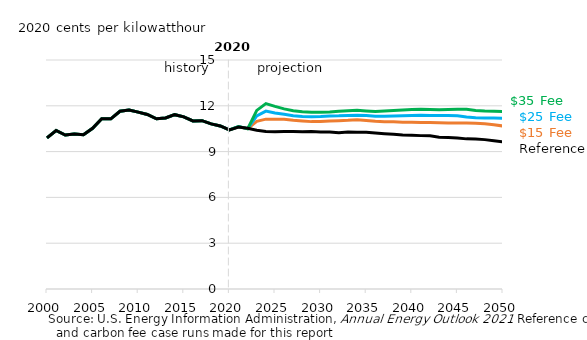
| Category | $15 Fee case | $25 Fee case | $35 Fee case | Reference |
|---|---|---|---|---|
| 2000.0 | 9.901 | 9.901 | 9.901 | 9.901 |
| 2001.0 | 10.382 | 10.382 | 10.382 | 10.382 |
| 2002.0 | 10.082 | 10.082 | 10.082 | 10.082 |
| 2003.0 | 10.148 | 10.148 | 10.148 | 10.148 |
| 2004.0 | 10.103 | 10.103 | 10.103 | 10.103 |
| 2005.0 | 10.523 | 10.523 | 10.523 | 10.523 |
| 2006.0 | 11.154 | 11.154 | 11.154 | 11.154 |
| 2007.0 | 11.148 | 11.148 | 11.148 | 11.148 |
| 2008.0 | 11.644 | 11.644 | 11.644 | 11.644 |
| 2009.0 | 11.718 | 11.718 | 11.718 | 11.718 |
| 2010.0 | 11.586 | 11.586 | 11.586 | 11.586 |
| 2011.0 | 11.431 | 11.431 | 11.431 | 11.431 |
| 2012.0 | 11.151 | 11.151 | 11.151 | 11.151 |
| 2013.0 | 11.205 | 11.205 | 11.205 | 11.205 |
| 2014.0 | 11.418 | 11.418 | 11.418 | 11.418 |
| 2015.0 | 11.276 | 11.276 | 11.276 | 11.276 |
| 2016.0 | 11.011 | 11.011 | 11.011 | 11.011 |
| 2017.0 | 11.025 | 11.025 | 11.025 | 11.025 |
| 2018.0 | 10.818 | 10.818 | 10.818 | 10.818 |
| 2019.0 | 10.678 | 10.678 | 10.678 | 10.678 |
| 2020.0 | 10.417 | 10.415 | 10.415 | 10.417 |
| 2021.0 | 10.629 | 10.64 | 10.644 | 10.604 |
| 2022.0 | 10.502 | 10.502 | 10.493 | 10.523 |
| 2023.0 | 10.979 | 11.344 | 11.699 | 10.405 |
| 2024.0 | 11.127 | 11.653 | 12.145 | 10.316 |
| 2025.0 | 11.116 | 11.533 | 11.96 | 10.295 |
| 2026.0 | 11.119 | 11.44 | 11.796 | 10.309 |
| 2027.0 | 11.052 | 11.351 | 11.671 | 10.316 |
| 2028.0 | 11.002 | 11.303 | 11.615 | 10.306 |
| 2029.0 | 10.964 | 11.282 | 11.574 | 10.314 |
| 2030.0 | 10.979 | 11.301 | 11.58 | 10.279 |
| 2031.0 | 10.996 | 11.337 | 11.589 | 10.281 |
| 2032.0 | 11.019 | 11.342 | 11.637 | 10.239 |
| 2033.0 | 11.046 | 11.369 | 11.679 | 10.282 |
| 2034.0 | 11.087 | 11.376 | 11.704 | 10.269 |
| 2035.0 | 11.043 | 11.36 | 11.66 | 10.266 |
| 2036.0 | 10.985 | 11.314 | 11.629 | 10.217 |
| 2037.0 | 10.96 | 11.317 | 11.662 | 10.177 |
| 2038.0 | 10.95 | 11.327 | 11.694 | 10.133 |
| 2039.0 | 10.924 | 11.341 | 11.72 | 10.093 |
| 2040.0 | 10.926 | 11.361 | 11.756 | 10.071 |
| 2041.0 | 10.914 | 11.377 | 11.769 | 10.046 |
| 2042.0 | 10.911 | 11.372 | 11.758 | 10.033 |
| 2043.0 | 10.889 | 11.358 | 11.746 | 9.944 |
| 2044.0 | 10.873 | 11.369 | 11.765 | 9.923 |
| 2045.0 | 10.876 | 11.342 | 11.778 | 9.891 |
| 2046.0 | 10.876 | 11.264 | 11.766 | 9.834 |
| 2047.0 | 10.85 | 11.21 | 11.695 | 9.822 |
| 2048.0 | 10.82 | 11.199 | 11.663 | 9.785 |
| 2049.0 | 10.762 | 11.208 | 11.647 | 9.709 |
| 2050.0 | 10.676 | 11.173 | 11.624 | 9.634 |